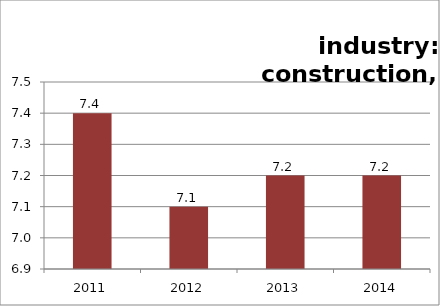
| Category | F: Construction |
|---|---|
| 2011.0 | 7.4 |
| 2012.0 | 7.1 |
| 2013.0 | 7.2 |
| 2014.0 | 7.2 |